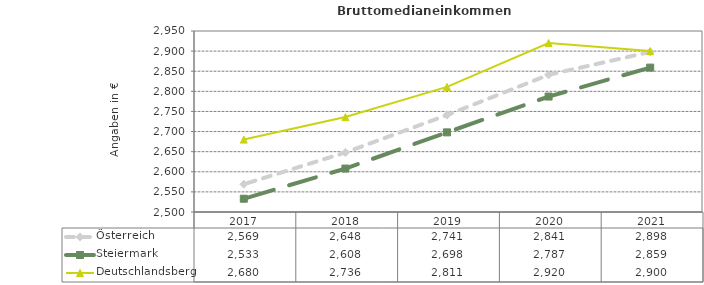
| Category | Österreich | Steiermark | Deutschlandsberg |
|---|---|---|---|
| 2021.0 | 2898 | 2859 | 2900 |
| 2020.0 | 2841 | 2787 | 2920 |
| 2019.0 | 2741 | 2698 | 2811 |
| 2018.0 | 2648 | 2608 | 2736 |
| 2017.0 | 2569 | 2533 | 2680 |